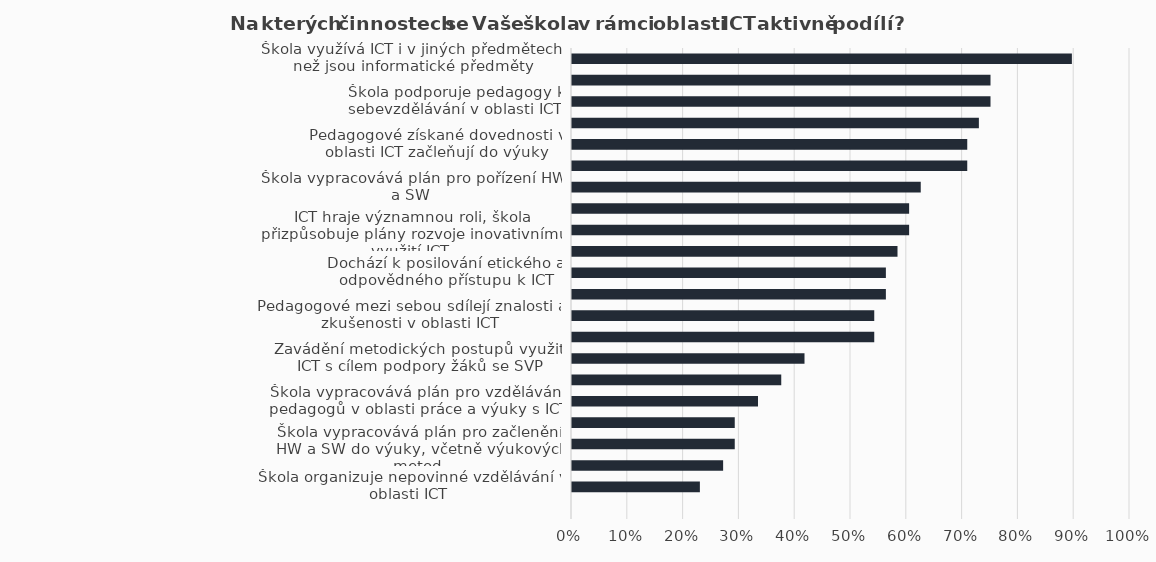
| Category | Series 1 |
|---|---|
| Škola využívá ICT i v jiných předmětech, než jsou informatické předměty | 0.896 |
| Škola nastavuje pravidla použití ICT prostřednictvím školního řádu | 0.75 |
| Škola podporuje pedagogy k sebevzdělávání v oblasti ICT | 0.75 |
| Škola motivuje žáky i pedagogy k účelnému používání ICT | 0.729 |
| Pedagogové získané dovednosti v oblasti ICT začleňují do výuky | 0.708 |
| Pedagogové plánují výuku s použitím ICT a nových výukových metod | 0.708 |
| Škola vypracovává plán pro pořízení HW a SW | 0.625 |
| Žáci jsou schopni efektivně využívat ICT v další profesní a studijní dráze | 0.604 |
| ICT hraje významnou roli, škola přizpůsobuje plány rozvoje inovativnímu využití ICT | 0.604 |
| Škola hledá nové možnosti zdokonalení stávajících postupů v oblasti výuky ICT | 0.583 |
| Dochází k posilování etického a odpovědného přístupu k ICT | 0.562 |
| Škola rozvíjí ICT kompetence u svých zaměstnanců pomocí průběžného vzdělávání | 0.562 |
| Pedagogové mezi sebou sdílejí znalosti a zkušenosti v oblasti ICT | 0.542 |
| Škola aktivně hledá novinky v oblasti SW a HW pro výuku a moderních metod výuky | 0.542 |
| Zavádění metodických postupů využití ICT s cílem podpory žáků se SVP | 0.417 |
| Škola organizuje kroužky v oblasti ICT | 0.375 |
| Škola vypracovává plán pro vzdělávání pedagogů v oblasti práce a výuky s ICT | 0.333 |
| Pedagogové konzultují plán výuky a svého rozvoje s ICT koordinátorem/metodikem | 0.292 |
| Škola vypracovává plán pro začlenění HW a SW do výuky, včetně výukových metod | 0.292 |
| Škola využívá osobní zařízení studentů pro potřeby výuky (BYOD) | 0.271 |
| Škola organizuje nepovinné vzdělávání v oblasti ICT | 0.229 |
| Jiné | 0 |